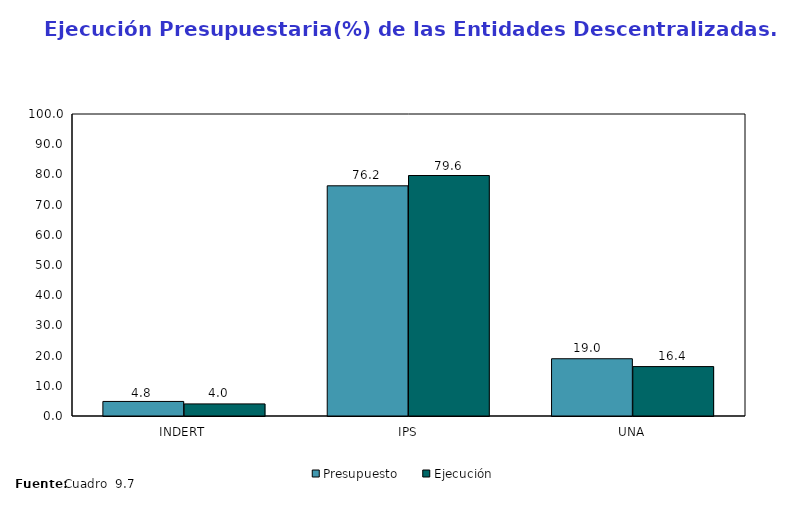
| Category | Presupuesto | Ejecución |
|---|---|---|
| INDERT | 4.819 | 4.007 |
| IPS | 76.222 | 79.632 |
| UNA | 18.959 | 16.36 |